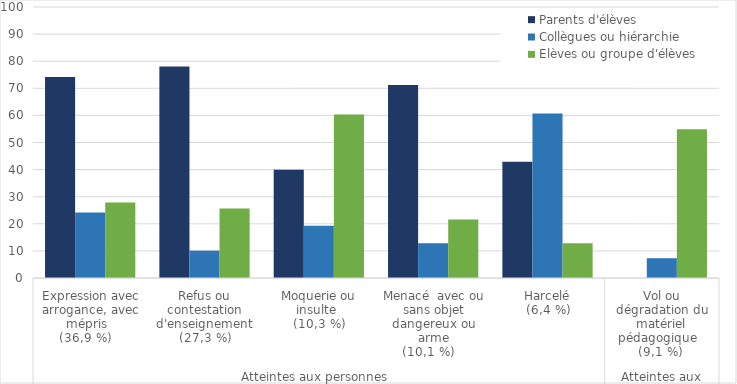
| Category | Parents d'élèves  | Collègues ou hiérarchie | Elèves ou groupe d'élèves |
|---|---|---|---|
| 0 | 74.2 | 24.2 | 27.9 |
| 1 | 78 | 10.1 | 25.6 |
| 2 | 39.9 | 19.3 | 60.3 |
| 3 | 71.2 | 12.8 | 21.6 |
| 4 | 42.9 | 60.7 | 12.8 |
| 5 | 0 | 7.3 | 54.9 |